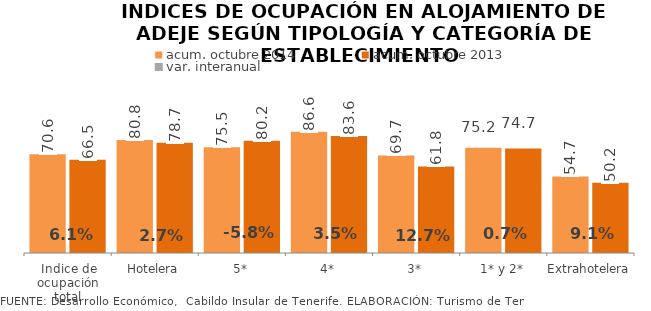
| Category | acum. octubre 2014 | acum. octubre 2013 |
|---|---|---|
| Indice de ocupación total | 70.592 | 66.539 |
| Hotelera | 80.765 | 78.664 |
| 5* | 75.549 | 80.225 |
| 4* | 86.572 | 83.619 |
| 3* | 69.66 | 61.793 |
| 1* y 2* | 75.225 | 74.72 |
| Extrahotelera | 54.713 | 50.16 |